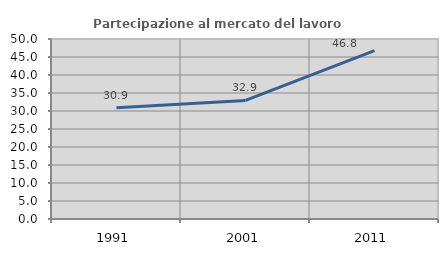
| Category | Partecipazione al mercato del lavoro  femminile |
|---|---|
| 1991.0 | 30.876 |
| 2001.0 | 32.932 |
| 2011.0 | 46.795 |